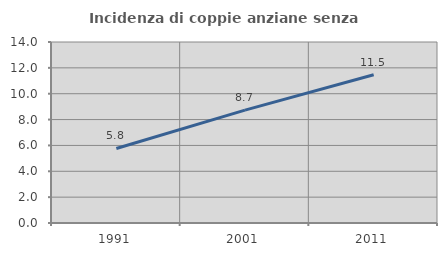
| Category | Incidenza di coppie anziane senza figli  |
|---|---|
| 1991.0 | 5.764 |
| 2001.0 | 8.732 |
| 2011.0 | 11.467 |